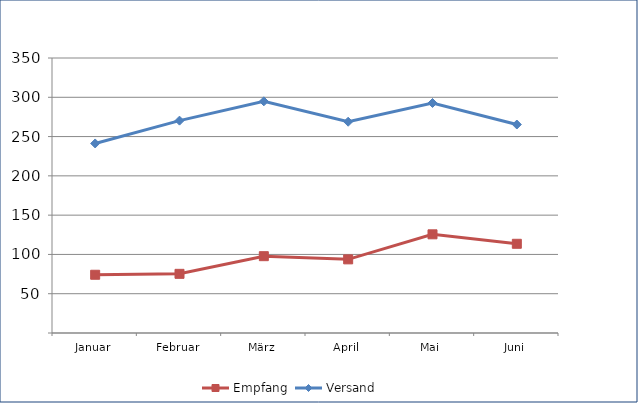
| Category | Empfang | Versand |
|---|---|---|
| Januar | 74.117 | 241.252 |
| Februar | 75.291 | 270.281 |
| März | 97.763 | 294.851 |
| April | 93.723 | 268.902 |
| Mai | 125.583 | 292.732 |
| Juni | 113.532 | 265.327 |